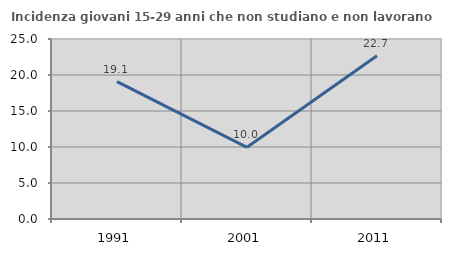
| Category | Incidenza giovani 15-29 anni che non studiano e non lavorano  |
|---|---|
| 1991.0 | 19.074 |
| 2001.0 | 9.955 |
| 2011.0 | 22.674 |